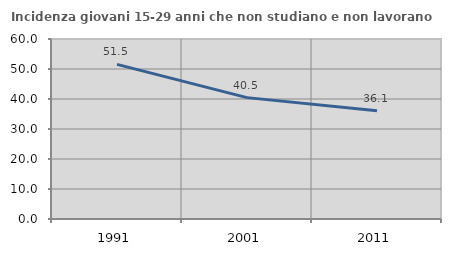
| Category | Incidenza giovani 15-29 anni che non studiano e non lavorano  |
|---|---|
| 1991.0 | 51.543 |
| 2001.0 | 40.456 |
| 2011.0 | 36.104 |